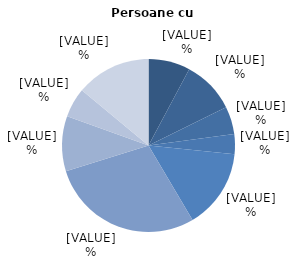
| Category | Persoane cu dizabilități |
|---|---|
| Legislatori, conducători ai administrației publice | 7.8 |
| Specialişti în diverse domenii de activitate | 9.9 |
| Tehnicieni și alți specialişti cu nivel mediu de calificare | 5.2 |
| Funcţionari administrativi | 3.7 |
| Lucrători în domeniul serviciilor și în comerţ | 14.9 |
| Lucrători calificaţi în agricultură | 28.7 |
| Muncitori calificaţi și asimilați | 10.3 |
| Operatori la maşini și instalaţii | 5.5 |
| Muncitori necalificaţi | 14 |